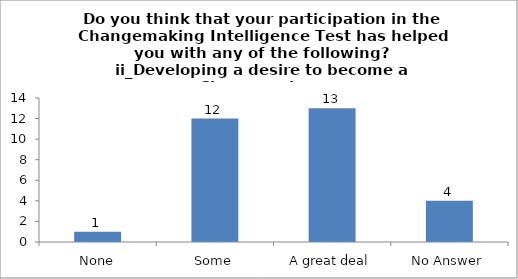
| Category | Do you think that your participation in the Changemaking Intelligence Test has helped you with any of the following?
ii_Developing a desire to become a Changemaker. |
|---|---|
| None | 1 |
| Some | 12 |
| A great deal | 13 |
| No Answer | 4 |